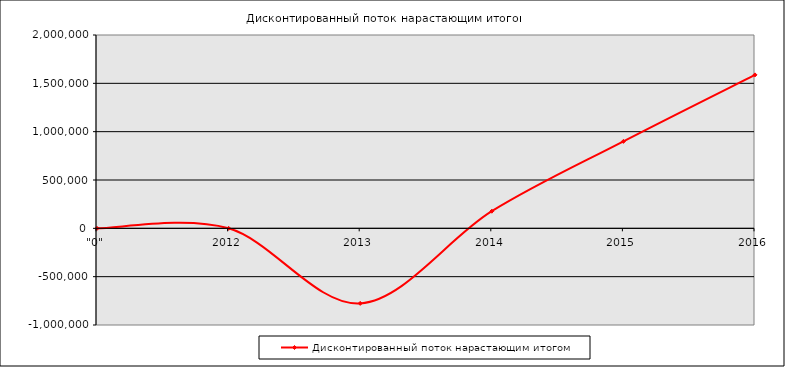
| Category | Дисконтированный поток нарастающим итогом |
|---|---|
| "0" | 0 |
| 2012 | 0 |
| 2013 | -776441.003 |
| 2014 | 177120.081 |
| 2015 | 899528.661 |
| 2016 | 1587364.323 |